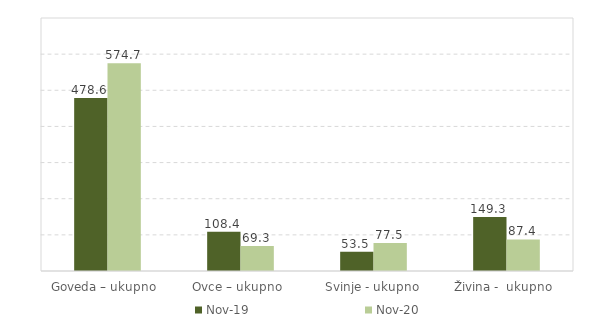
| Category | Nov-19 | Nov-20 |
|---|---|---|
| Goveda – ukupno  | 478.6 | 574.7 |
| Ovce – ukupno  | 108.4 | 69.3 |
| Svinje - ukupno | 53.5 | 77.5 |
| Živina -  ukupno  | 149.3 | 87.4 |